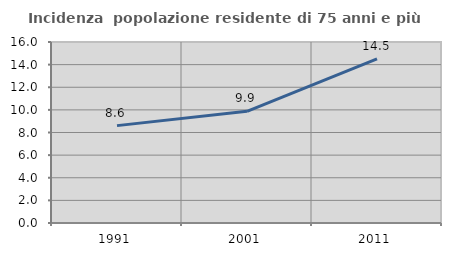
| Category | Incidenza  popolazione residente di 75 anni e più |
|---|---|
| 1991.0 | 8.608 |
| 2001.0 | 9.869 |
| 2011.0 | 14.516 |